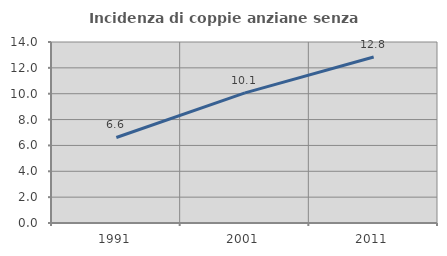
| Category | Incidenza di coppie anziane senza figli  |
|---|---|
| 1991.0 | 6.617 |
| 2001.0 | 10.061 |
| 2011.0 | 12.836 |